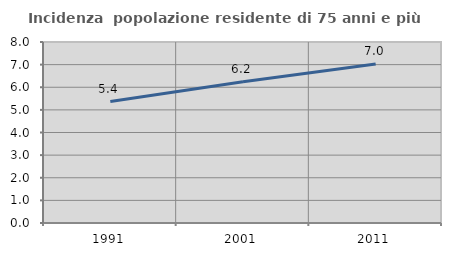
| Category | Incidenza  popolazione residente di 75 anni e più |
|---|---|
| 1991.0 | 5.37 |
| 2001.0 | 6.245 |
| 2011.0 | 7.029 |